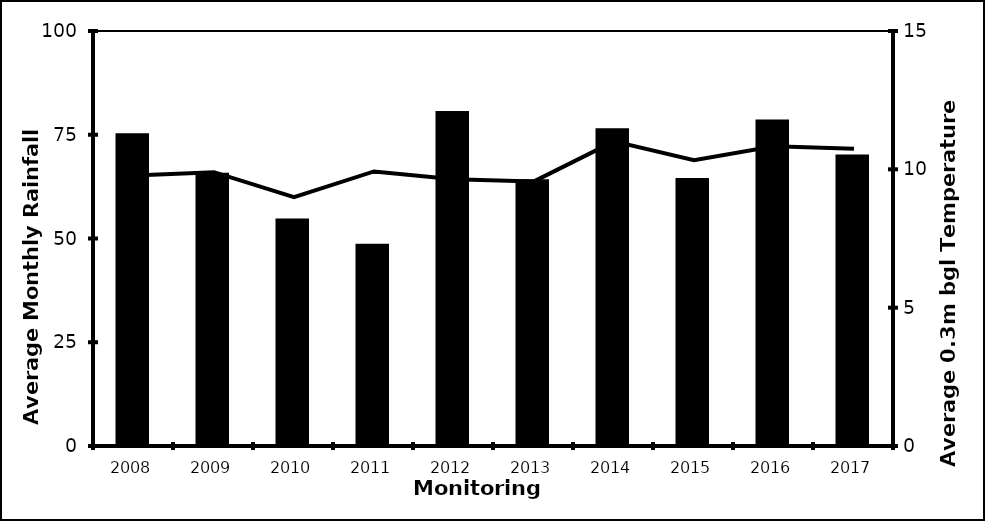
| Category | yearly rainfall average |
|---|---|
| 2008.0 | 74.985 |
| 2009.0 | 65.485 |
| 2010.0 | 54.452 |
| 2011.0 | 48.39 |
| 2012.0 | 80.369 |
| 2013.0 | 63.917 |
| 2014.0 | 76.183 |
| 2015.0 | 64.2 |
| 2016.0 | 78.317 |
| 2017.0 | 69.867 |